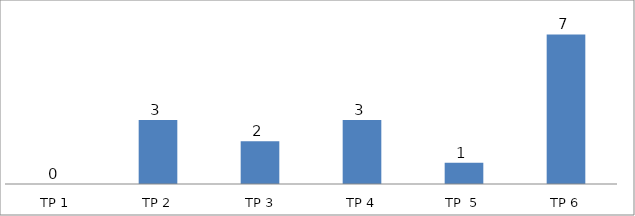
| Category | BIL. MURID |
|---|---|
| TP 1 | 0 |
| TP 2 | 3 |
|  TP 3 | 2 |
| TP 4 | 3 |
| TP  5 | 1 |
| TP 6 | 7 |